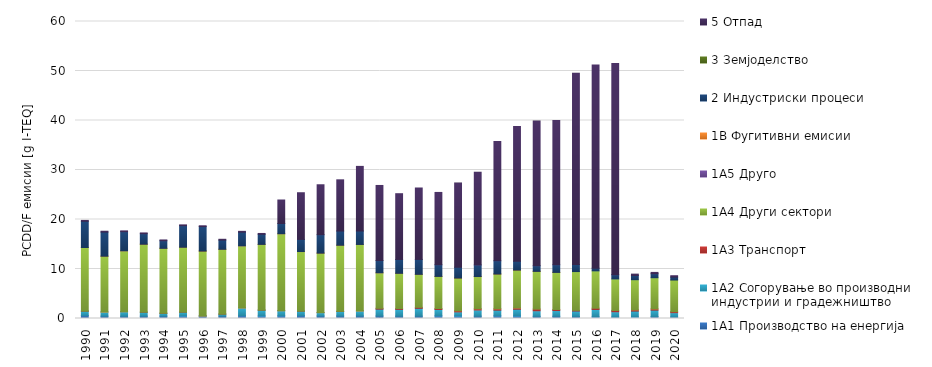
| Category | 1A1 | 1A2 | 1A3 | 1A4 | 1A5 | 1B | 2 | 3 | 5 |
|---|---|---|---|---|---|---|---|---|---|
| 1990 | 0.594 | 0.894 | 0 | 12.85 | 0 | 0.007 | 5.304 | 0 | 0.167 |
| 1991 | 0.468 | 0.847 | 0 | 11.271 | 0 | 0.005 | 4.87 | 0 | 0.166 |
| 1992 | 0.452 | 0.913 | 0 | 12.3 | 0 | 0.003 | 3.868 | 0 | 0.166 |
| 1993 | 0.466 | 0.815 | 0 | 13.723 | 0 | 0.006 | 2.114 | 0 | 0.166 |
| 1994 | 0.482 | 0.581 | 0 | 13.115 | 0 | 0.001 | 1.529 | 0 | 0.165 |
| 1995 | 0.507 | 0.782 | 0 | 13.109 | 0 | 0.001 | 4.353 | 0 | 0.164 |
| 1996 | 0.487 | 0.035 | 0 | 13.102 | 0 | 0.004 | 4.94 | 0 | 0.164 |
| 1997 | 0.503 | 0.384 | 0 | 13.094 | 0 | 0.002 | 1.856 | 0 | 0.162 |
| 1998 | 0.561 | 1.582 | 0 | 12.524 | 0 | 0.004 | 2.776 | 0 | 0.159 |
| 1999 | 0.51 | 1.181 | 0 | 13.276 | 0 | 0.004 | 2.051 | 0 | 0.158 |
| 2000 | 0.538 | 1.031 | 0 | 15.545 | 0 | 0.006 | 2.073 | 0 | 4.746 |
| 2001 | 0.576 | 0.923 | 0 | 12.022 | 0 | 0.006 | 2.452 | 0 | 9.429 |
| 2002 | 0.5 | 0.687 | 0 | 12.019 | 0 | 0.004 | 3.719 | 0 | 10.088 |
| 2003 | 0.501 | 0.942 | 0 | 13.356 | 0 | 0.004 | 2.868 | 0 | 10.345 |
| 2004 | 0.503 | 1.027 | 0 | 13.424 | 0 | 0.006 | 2.712 | 0 | 13.055 |
| 2005 | 0.497 | 1.385 | 0.176 | 7.166 | 0 | 0.005 | 2.476 | 0 | 15.173 |
| 2006 | 0.467 | 1.372 | 0.176 | 7.108 | 0 | 0.006 | 2.797 | 0 | 13.285 |
| 2007 | 0.477 | 1.579 | 0.203 | 6.659 | 0 | 0.006 | 3.01 | 0 | 14.431 |
| 2008 | 0.532 | 1.283 | 0.21 | 6.471 | 0 | 0.006 | 2.354 | 0 | 14.61 |
| 2009 | 0.513 | 0.823 | 0.23 | 6.605 | 0 | 0.006 | 2.177 | 0 | 16.998 |
| 2010 | 0.475 | 1.243 | 0.253 | 6.503 | 0 | 0.005 | 2.349 | 0 | 18.73 |
| 2011 | 0.539 | 1.143 | 0.28 | 7.02 | 0 | 0.004 | 2.663 | 0 | 24.132 |
| 2012 | 0.512 | 1.349 | 0.284 | 7.641 | 0 | 0.001 | 1.761 | 0 | 27.226 |
| 2013 | 0.438 | 1.123 | 0.333 | 7.626 | 0 | 0 | 1.14 | 0 | 29.22 |
| 2014 | 0.446 | 1.162 | 0.212 | 7.492 | 0 | 0 | 1.528 | 0 | 29.155 |
| 2015 | 0.402 | 1.108 | 0.14 | 7.828 | 0 | 0 | 1.418 | 0 | 38.624 |
| 2016 | 0.332 | 1.485 | 0.261 | 7.542 | 0 | 0 | 0.54 | 0 | 41.054 |
| 2017 | 0.288 | 1.076 | 0.263 | 6.363 | 0 | 0 | 0.871 | 0 | 42.674 |
| 2018 | 0.317 | 1.179 | 0.262 | 6.075 | 0 | 0 | 0.861 | 0 | 0.267 |
| 2019 | 0.378 | 1.308 | 0.265 | 6.283 | 0 | 0 | 0.807 | 0 | 0.27 |
| 2020 | 0.29 | 0.888 | 0.207 | 6.388 | 0 | 0 | 0.589 | 0 | 0.281 |